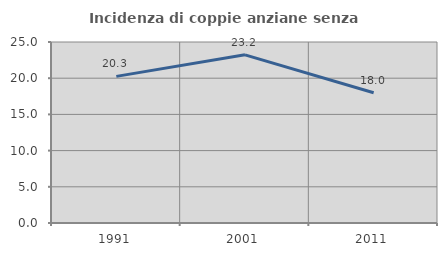
| Category | Incidenza di coppie anziane senza figli  |
|---|---|
| 1991.0 | 20.253 |
| 2001.0 | 23.226 |
| 2011.0 | 17.986 |